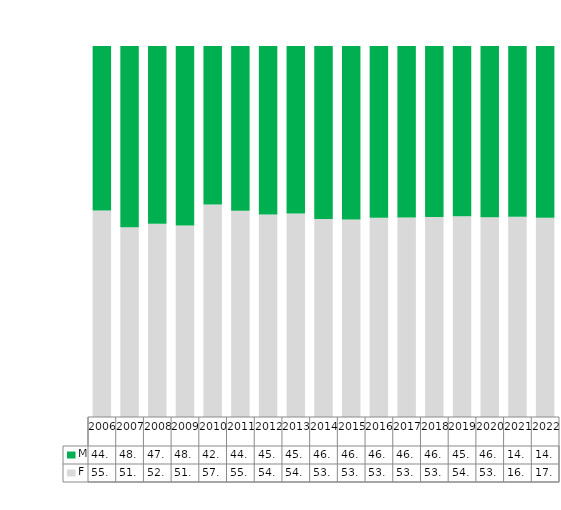
| Category | F | M |
|---|---|---|
| 2006.0 | 0.557 | 0.443 |
| 2007.0 | 0.511 | 0.489 |
| 2008.0 | 0.521 | 0.479 |
| 2009.0 | 0.516 | 0.484 |
| 2010.0 | 0.573 | 0.427 |
| 2011.0 | 0.556 | 0.444 |
| 2012.0 | 0.546 | 0.454 |
| 2013.0 | 0.549 | 0.451 |
| 2014.0 | 0.534 | 0.466 |
| 2015.0 | 0.532 | 0.468 |
| 2016.0 | 0.537 | 0.463 |
| 2017.0 | 0.538 | 0.462 |
| 2018.0 | 0.539 | 0.461 |
| 2019.0 | 0.541 | 0.459 |
| 2020.0 | 0.539 | 0.461 |
| 2021.0 | 0.169 | 0.144 |
| 2022.0 | 0.171 | 0.148 |